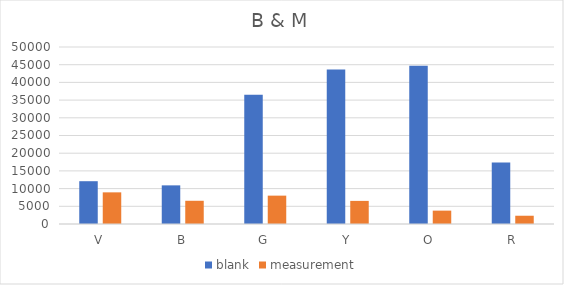
| Category | blank | measurement |
|---|---|---|
| V | 12089 | 8940 |
| B | 10915 | 6560 |
| G | 36534 | 8011 |
| Y | 43621 | 6528 |
| O | 44679 | 3776 |
| R | 17338 | 2334 |